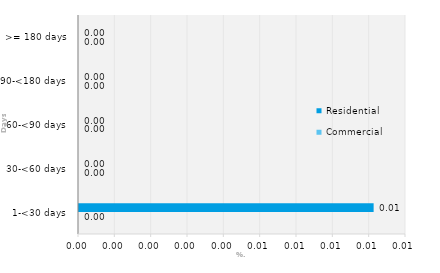
| Category | Commercial | Residential |
|---|---|---|
| 1-<30 days | 0 | 0.008 |
| 30-<60 days | 0 | 0 |
| 60-<90 days | 0 | 0 |
| 90-<180 days | 0 | 0 |
| >= 180 days | 0 | 0 |